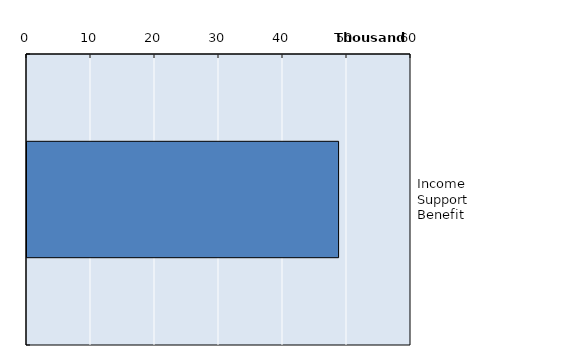
| Category | Series 0 |
|---|---|
| Income Support Benefit | 48685 |